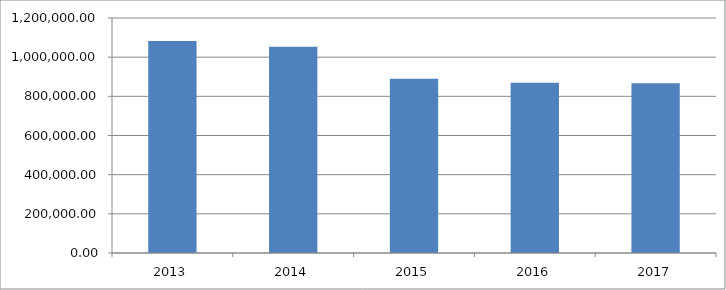
| Category | Series 0 |
|---|---|
| 2013.0 | 1083027.759 |
| 2014.0 | 1053564.854 |
| 2015.0 | 889633.659 |
| 2016.0 | 869592.077 |
| 2017.0 | 866775.07 |